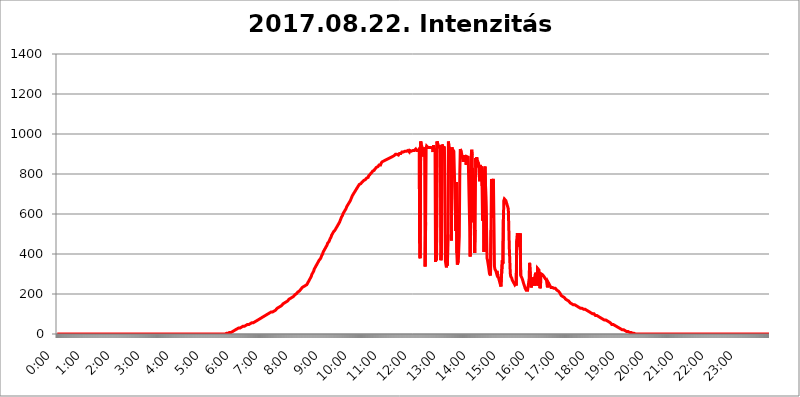
| Category | 2017.08.22. Intenzitás [W/m^2] |
|---|---|
| 0.0 | 0 |
| 0.0006944444444444445 | 0 |
| 0.001388888888888889 | 0 |
| 0.0020833333333333333 | 0 |
| 0.002777777777777778 | 0 |
| 0.003472222222222222 | 0 |
| 0.004166666666666667 | 0 |
| 0.004861111111111111 | 0 |
| 0.005555555555555556 | 0 |
| 0.0062499999999999995 | 0 |
| 0.006944444444444444 | 0 |
| 0.007638888888888889 | 0 |
| 0.008333333333333333 | 0 |
| 0.009027777777777779 | 0 |
| 0.009722222222222222 | 0 |
| 0.010416666666666666 | 0 |
| 0.011111111111111112 | 0 |
| 0.011805555555555555 | 0 |
| 0.012499999999999999 | 0 |
| 0.013194444444444444 | 0 |
| 0.013888888888888888 | 0 |
| 0.014583333333333332 | 0 |
| 0.015277777777777777 | 0 |
| 0.015972222222222224 | 0 |
| 0.016666666666666666 | 0 |
| 0.017361111111111112 | 0 |
| 0.018055555555555557 | 0 |
| 0.01875 | 0 |
| 0.019444444444444445 | 0 |
| 0.02013888888888889 | 0 |
| 0.020833333333333332 | 0 |
| 0.02152777777777778 | 0 |
| 0.022222222222222223 | 0 |
| 0.02291666666666667 | 0 |
| 0.02361111111111111 | 0 |
| 0.024305555555555556 | 0 |
| 0.024999999999999998 | 0 |
| 0.025694444444444447 | 0 |
| 0.02638888888888889 | 0 |
| 0.027083333333333334 | 0 |
| 0.027777777777777776 | 0 |
| 0.02847222222222222 | 0 |
| 0.029166666666666664 | 0 |
| 0.029861111111111113 | 0 |
| 0.030555555555555555 | 0 |
| 0.03125 | 0 |
| 0.03194444444444445 | 0 |
| 0.03263888888888889 | 0 |
| 0.03333333333333333 | 0 |
| 0.034027777777777775 | 0 |
| 0.034722222222222224 | 0 |
| 0.035416666666666666 | 0 |
| 0.036111111111111115 | 0 |
| 0.03680555555555556 | 0 |
| 0.0375 | 0 |
| 0.03819444444444444 | 0 |
| 0.03888888888888889 | 0 |
| 0.03958333333333333 | 0 |
| 0.04027777777777778 | 0 |
| 0.04097222222222222 | 0 |
| 0.041666666666666664 | 0 |
| 0.042361111111111106 | 0 |
| 0.04305555555555556 | 0 |
| 0.043750000000000004 | 0 |
| 0.044444444444444446 | 0 |
| 0.04513888888888889 | 0 |
| 0.04583333333333334 | 0 |
| 0.04652777777777778 | 0 |
| 0.04722222222222222 | 0 |
| 0.04791666666666666 | 0 |
| 0.04861111111111111 | 0 |
| 0.049305555555555554 | 0 |
| 0.049999999999999996 | 0 |
| 0.05069444444444445 | 0 |
| 0.051388888888888894 | 0 |
| 0.052083333333333336 | 0 |
| 0.05277777777777778 | 0 |
| 0.05347222222222222 | 0 |
| 0.05416666666666667 | 0 |
| 0.05486111111111111 | 0 |
| 0.05555555555555555 | 0 |
| 0.05625 | 0 |
| 0.05694444444444444 | 0 |
| 0.057638888888888885 | 0 |
| 0.05833333333333333 | 0 |
| 0.05902777777777778 | 0 |
| 0.059722222222222225 | 0 |
| 0.06041666666666667 | 0 |
| 0.061111111111111116 | 0 |
| 0.06180555555555556 | 0 |
| 0.0625 | 0 |
| 0.06319444444444444 | 0 |
| 0.06388888888888888 | 0 |
| 0.06458333333333334 | 0 |
| 0.06527777777777778 | 0 |
| 0.06597222222222222 | 0 |
| 0.06666666666666667 | 0 |
| 0.06736111111111111 | 0 |
| 0.06805555555555555 | 0 |
| 0.06874999999999999 | 0 |
| 0.06944444444444443 | 0 |
| 0.07013888888888889 | 0 |
| 0.07083333333333333 | 0 |
| 0.07152777777777779 | 0 |
| 0.07222222222222223 | 0 |
| 0.07291666666666667 | 0 |
| 0.07361111111111111 | 0 |
| 0.07430555555555556 | 0 |
| 0.075 | 0 |
| 0.07569444444444444 | 0 |
| 0.0763888888888889 | 0 |
| 0.07708333333333334 | 0 |
| 0.07777777777777778 | 0 |
| 0.07847222222222222 | 0 |
| 0.07916666666666666 | 0 |
| 0.0798611111111111 | 0 |
| 0.08055555555555556 | 0 |
| 0.08125 | 0 |
| 0.08194444444444444 | 0 |
| 0.08263888888888889 | 0 |
| 0.08333333333333333 | 0 |
| 0.08402777777777777 | 0 |
| 0.08472222222222221 | 0 |
| 0.08541666666666665 | 0 |
| 0.08611111111111112 | 0 |
| 0.08680555555555557 | 0 |
| 0.08750000000000001 | 0 |
| 0.08819444444444445 | 0 |
| 0.08888888888888889 | 0 |
| 0.08958333333333333 | 0 |
| 0.09027777777777778 | 0 |
| 0.09097222222222222 | 0 |
| 0.09166666666666667 | 0 |
| 0.09236111111111112 | 0 |
| 0.09305555555555556 | 0 |
| 0.09375 | 0 |
| 0.09444444444444444 | 0 |
| 0.09513888888888888 | 0 |
| 0.09583333333333333 | 0 |
| 0.09652777777777777 | 0 |
| 0.09722222222222222 | 0 |
| 0.09791666666666667 | 0 |
| 0.09861111111111111 | 0 |
| 0.09930555555555555 | 0 |
| 0.09999999999999999 | 0 |
| 0.10069444444444443 | 0 |
| 0.1013888888888889 | 0 |
| 0.10208333333333335 | 0 |
| 0.10277777777777779 | 0 |
| 0.10347222222222223 | 0 |
| 0.10416666666666667 | 0 |
| 0.10486111111111111 | 0 |
| 0.10555555555555556 | 0 |
| 0.10625 | 0 |
| 0.10694444444444444 | 0 |
| 0.1076388888888889 | 0 |
| 0.10833333333333334 | 0 |
| 0.10902777777777778 | 0 |
| 0.10972222222222222 | 0 |
| 0.1111111111111111 | 0 |
| 0.11180555555555556 | 0 |
| 0.11180555555555556 | 0 |
| 0.1125 | 0 |
| 0.11319444444444444 | 0 |
| 0.11388888888888889 | 0 |
| 0.11458333333333333 | 0 |
| 0.11527777777777777 | 0 |
| 0.11597222222222221 | 0 |
| 0.11666666666666665 | 0 |
| 0.1173611111111111 | 0 |
| 0.11805555555555557 | 0 |
| 0.11944444444444445 | 0 |
| 0.12013888888888889 | 0 |
| 0.12083333333333333 | 0 |
| 0.12152777777777778 | 0 |
| 0.12222222222222223 | 0 |
| 0.12291666666666667 | 0 |
| 0.12291666666666667 | 0 |
| 0.12361111111111112 | 0 |
| 0.12430555555555556 | 0 |
| 0.125 | 0 |
| 0.12569444444444444 | 0 |
| 0.12638888888888888 | 0 |
| 0.12708333333333333 | 0 |
| 0.16875 | 0 |
| 0.12847222222222224 | 0 |
| 0.12916666666666668 | 0 |
| 0.12986111111111112 | 0 |
| 0.13055555555555556 | 0 |
| 0.13125 | 0 |
| 0.13194444444444445 | 0 |
| 0.1326388888888889 | 0 |
| 0.13333333333333333 | 0 |
| 0.13402777777777777 | 0 |
| 0.13402777777777777 | 0 |
| 0.13472222222222222 | 0 |
| 0.13541666666666666 | 0 |
| 0.1361111111111111 | 0 |
| 0.13749999999999998 | 0 |
| 0.13819444444444443 | 0 |
| 0.1388888888888889 | 0 |
| 0.13958333333333334 | 0 |
| 0.14027777777777778 | 0 |
| 0.14097222222222222 | 0 |
| 0.14166666666666666 | 0 |
| 0.1423611111111111 | 0 |
| 0.14305555555555557 | 0 |
| 0.14375000000000002 | 0 |
| 0.14444444444444446 | 0 |
| 0.1451388888888889 | 0 |
| 0.1451388888888889 | 0 |
| 0.14652777777777778 | 0 |
| 0.14722222222222223 | 0 |
| 0.14791666666666667 | 0 |
| 0.1486111111111111 | 0 |
| 0.14930555555555555 | 0 |
| 0.15 | 0 |
| 0.15069444444444444 | 0 |
| 0.15138888888888888 | 0 |
| 0.15208333333333332 | 0 |
| 0.15277777777777776 | 0 |
| 0.15347222222222223 | 0 |
| 0.15416666666666667 | 0 |
| 0.15486111111111112 | 0 |
| 0.15555555555555556 | 0 |
| 0.15625 | 0 |
| 0.15694444444444444 | 0 |
| 0.15763888888888888 | 0 |
| 0.15833333333333333 | 0 |
| 0.15902777777777777 | 0 |
| 0.15972222222222224 | 0 |
| 0.16041666666666668 | 0 |
| 0.16111111111111112 | 0 |
| 0.16180555555555556 | 0 |
| 0.1625 | 0 |
| 0.16319444444444445 | 0 |
| 0.1638888888888889 | 0 |
| 0.16458333333333333 | 0 |
| 0.16527777777777777 | 0 |
| 0.16597222222222222 | 0 |
| 0.16666666666666666 | 0 |
| 0.1673611111111111 | 0 |
| 0.16805555555555554 | 0 |
| 0.16874999999999998 | 0 |
| 0.16944444444444443 | 0 |
| 0.17013888888888887 | 0 |
| 0.1708333333333333 | 0 |
| 0.17152777777777775 | 0 |
| 0.17222222222222225 | 0 |
| 0.1729166666666667 | 0 |
| 0.17361111111111113 | 0 |
| 0.17430555555555557 | 0 |
| 0.17500000000000002 | 0 |
| 0.17569444444444446 | 0 |
| 0.1763888888888889 | 0 |
| 0.17708333333333334 | 0 |
| 0.17777777777777778 | 0 |
| 0.17847222222222223 | 0 |
| 0.17916666666666667 | 0 |
| 0.1798611111111111 | 0 |
| 0.18055555555555555 | 0 |
| 0.18125 | 0 |
| 0.18194444444444444 | 0 |
| 0.1826388888888889 | 0 |
| 0.18333333333333335 | 0 |
| 0.1840277777777778 | 0 |
| 0.18472222222222223 | 0 |
| 0.18541666666666667 | 0 |
| 0.18611111111111112 | 0 |
| 0.18680555555555556 | 0 |
| 0.1875 | 0 |
| 0.18819444444444444 | 0 |
| 0.18888888888888888 | 0 |
| 0.18958333333333333 | 0 |
| 0.19027777777777777 | 0 |
| 0.1909722222222222 | 0 |
| 0.19166666666666665 | 0 |
| 0.19236111111111112 | 0 |
| 0.19305555555555554 | 0 |
| 0.19375 | 0 |
| 0.19444444444444445 | 0 |
| 0.1951388888888889 | 0 |
| 0.19583333333333333 | 0 |
| 0.19652777777777777 | 0 |
| 0.19722222222222222 | 0 |
| 0.19791666666666666 | 0 |
| 0.1986111111111111 | 0 |
| 0.19930555555555554 | 0 |
| 0.19999999999999998 | 0 |
| 0.20069444444444443 | 0 |
| 0.20138888888888887 | 0 |
| 0.2020833333333333 | 0 |
| 0.2027777777777778 | 0 |
| 0.2034722222222222 | 0 |
| 0.2041666666666667 | 0 |
| 0.20486111111111113 | 0 |
| 0.20555555555555557 | 0 |
| 0.20625000000000002 | 0 |
| 0.20694444444444446 | 0 |
| 0.2076388888888889 | 0 |
| 0.20833333333333334 | 0 |
| 0.20902777777777778 | 0 |
| 0.20972222222222223 | 0 |
| 0.21041666666666667 | 0 |
| 0.2111111111111111 | 0 |
| 0.21180555555555555 | 0 |
| 0.2125 | 0 |
| 0.21319444444444444 | 0 |
| 0.2138888888888889 | 0 |
| 0.21458333333333335 | 0 |
| 0.2152777777777778 | 0 |
| 0.21597222222222223 | 0 |
| 0.21666666666666667 | 0 |
| 0.21736111111111112 | 0 |
| 0.21805555555555556 | 0 |
| 0.21875 | 0 |
| 0.21944444444444444 | 0 |
| 0.22013888888888888 | 0 |
| 0.22083333333333333 | 0 |
| 0.22152777777777777 | 0 |
| 0.2222222222222222 | 0 |
| 0.22291666666666665 | 0 |
| 0.2236111111111111 | 0 |
| 0.22430555555555556 | 0 |
| 0.225 | 0 |
| 0.22569444444444445 | 0 |
| 0.2263888888888889 | 0 |
| 0.22708333333333333 | 0 |
| 0.22777777777777777 | 0 |
| 0.22847222222222222 | 0 |
| 0.22916666666666666 | 0 |
| 0.2298611111111111 | 0 |
| 0.23055555555555554 | 0 |
| 0.23124999999999998 | 0 |
| 0.23194444444444443 | 0 |
| 0.23263888888888887 | 0 |
| 0.2333333333333333 | 0 |
| 0.2340277777777778 | 0 |
| 0.2347222222222222 | 0 |
| 0.2354166666666667 | 0 |
| 0.23611111111111113 | 3.525 |
| 0.23680555555555557 | 3.525 |
| 0.23750000000000002 | 3.525 |
| 0.23819444444444446 | 3.525 |
| 0.2388888888888889 | 3.525 |
| 0.23958333333333334 | 3.525 |
| 0.24027777777777778 | 3.525 |
| 0.24097222222222223 | 3.525 |
| 0.24166666666666667 | 7.887 |
| 0.2423611111111111 | 7.887 |
| 0.24305555555555555 | 7.887 |
| 0.24375 | 7.887 |
| 0.24444444444444446 | 12.257 |
| 0.24513888888888888 | 12.257 |
| 0.24583333333333335 | 12.257 |
| 0.2465277777777778 | 12.257 |
| 0.24722222222222223 | 16.636 |
| 0.24791666666666667 | 16.636 |
| 0.24861111111111112 | 16.636 |
| 0.24930555555555556 | 21.024 |
| 0.25 | 21.024 |
| 0.25069444444444444 | 21.024 |
| 0.2513888888888889 | 25.419 |
| 0.2520833333333333 | 25.419 |
| 0.25277777777777777 | 25.419 |
| 0.2534722222222222 | 29.823 |
| 0.25416666666666665 | 29.823 |
| 0.2548611111111111 | 29.823 |
| 0.2555555555555556 | 29.823 |
| 0.25625000000000003 | 29.823 |
| 0.2569444444444445 | 34.234 |
| 0.2576388888888889 | 34.234 |
| 0.25833333333333336 | 34.234 |
| 0.2590277777777778 | 34.234 |
| 0.25972222222222224 | 34.234 |
| 0.2604166666666667 | 38.653 |
| 0.2611111111111111 | 38.653 |
| 0.26180555555555557 | 38.653 |
| 0.2625 | 38.653 |
| 0.26319444444444445 | 38.653 |
| 0.2638888888888889 | 43.079 |
| 0.26458333333333334 | 43.079 |
| 0.2652777777777778 | 43.079 |
| 0.2659722222222222 | 47.511 |
| 0.26666666666666666 | 47.511 |
| 0.2673611111111111 | 47.511 |
| 0.26805555555555555 | 47.511 |
| 0.26875 | 47.511 |
| 0.26944444444444443 | 51.951 |
| 0.2701388888888889 | 51.951 |
| 0.2708333333333333 | 51.951 |
| 0.27152777777777776 | 56.398 |
| 0.2722222222222222 | 56.398 |
| 0.27291666666666664 | 56.398 |
| 0.2736111111111111 | 56.398 |
| 0.2743055555555555 | 56.398 |
| 0.27499999999999997 | 56.398 |
| 0.27569444444444446 | 60.85 |
| 0.27638888888888885 | 60.85 |
| 0.27708333333333335 | 60.85 |
| 0.2777777777777778 | 65.31 |
| 0.27847222222222223 | 65.31 |
| 0.2791666666666667 | 65.31 |
| 0.2798611111111111 | 65.31 |
| 0.28055555555555556 | 69.775 |
| 0.28125 | 69.775 |
| 0.28194444444444444 | 69.775 |
| 0.2826388888888889 | 74.246 |
| 0.2833333333333333 | 74.246 |
| 0.28402777777777777 | 74.246 |
| 0.2847222222222222 | 78.722 |
| 0.28541666666666665 | 78.722 |
| 0.28611111111111115 | 78.722 |
| 0.28680555555555554 | 83.205 |
| 0.28750000000000003 | 83.205 |
| 0.2881944444444445 | 83.205 |
| 0.2888888888888889 | 83.205 |
| 0.28958333333333336 | 87.692 |
| 0.2902777777777778 | 87.692 |
| 0.29097222222222224 | 92.184 |
| 0.2916666666666667 | 92.184 |
| 0.2923611111111111 | 92.184 |
| 0.29305555555555557 | 92.184 |
| 0.29375 | 96.682 |
| 0.29444444444444445 | 96.682 |
| 0.2951388888888889 | 101.184 |
| 0.29583333333333334 | 101.184 |
| 0.2965277777777778 | 101.184 |
| 0.2972222222222222 | 101.184 |
| 0.29791666666666666 | 105.69 |
| 0.2986111111111111 | 105.69 |
| 0.29930555555555555 | 105.69 |
| 0.3 | 110.201 |
| 0.30069444444444443 | 110.201 |
| 0.3013888888888889 | 110.201 |
| 0.3020833333333333 | 110.201 |
| 0.30277777777777776 | 114.716 |
| 0.3034722222222222 | 114.716 |
| 0.30416666666666664 | 114.716 |
| 0.3048611111111111 | 119.235 |
| 0.3055555555555555 | 119.235 |
| 0.30624999999999997 | 119.235 |
| 0.3069444444444444 | 123.758 |
| 0.3076388888888889 | 123.758 |
| 0.30833333333333335 | 128.284 |
| 0.3090277777777778 | 128.284 |
| 0.30972222222222223 | 128.284 |
| 0.3104166666666667 | 132.814 |
| 0.3111111111111111 | 132.814 |
| 0.31180555555555556 | 137.347 |
| 0.3125 | 137.347 |
| 0.31319444444444444 | 141.884 |
| 0.3138888888888889 | 141.884 |
| 0.3145833333333333 | 141.884 |
| 0.31527777777777777 | 146.423 |
| 0.3159722222222222 | 146.423 |
| 0.31666666666666665 | 150.964 |
| 0.31736111111111115 | 150.964 |
| 0.31805555555555554 | 155.509 |
| 0.31875000000000003 | 155.509 |
| 0.3194444444444445 | 155.509 |
| 0.3201388888888889 | 160.056 |
| 0.32083333333333336 | 160.056 |
| 0.3215277777777778 | 160.056 |
| 0.32222222222222224 | 164.605 |
| 0.3229166666666667 | 164.605 |
| 0.3236111111111111 | 169.156 |
| 0.32430555555555557 | 169.156 |
| 0.325 | 173.709 |
| 0.32569444444444445 | 173.709 |
| 0.3263888888888889 | 173.709 |
| 0.32708333333333334 | 178.264 |
| 0.3277777777777778 | 178.264 |
| 0.3284722222222222 | 182.82 |
| 0.32916666666666666 | 182.82 |
| 0.3298611111111111 | 187.378 |
| 0.33055555555555555 | 187.378 |
| 0.33125 | 187.378 |
| 0.33194444444444443 | 191.937 |
| 0.3326388888888889 | 191.937 |
| 0.3333333333333333 | 196.497 |
| 0.3340277777777778 | 196.497 |
| 0.3347222222222222 | 201.058 |
| 0.3354166666666667 | 201.058 |
| 0.3361111111111111 | 205.62 |
| 0.3368055555555556 | 205.62 |
| 0.33749999999999997 | 210.182 |
| 0.33819444444444446 | 210.182 |
| 0.33888888888888885 | 214.746 |
| 0.33958333333333335 | 214.746 |
| 0.34027777777777773 | 219.309 |
| 0.34097222222222223 | 219.309 |
| 0.3416666666666666 | 223.873 |
| 0.3423611111111111 | 228.436 |
| 0.3430555555555555 | 228.436 |
| 0.34375 | 233 |
| 0.3444444444444445 | 233 |
| 0.3451388888888889 | 233 |
| 0.3458333333333334 | 237.564 |
| 0.34652777777777777 | 242.127 |
| 0.34722222222222227 | 242.127 |
| 0.34791666666666665 | 242.127 |
| 0.34861111111111115 | 246.689 |
| 0.34930555555555554 | 246.689 |
| 0.35000000000000003 | 246.689 |
| 0.3506944444444444 | 251.251 |
| 0.3513888888888889 | 255.813 |
| 0.3520833333333333 | 260.373 |
| 0.3527777777777778 | 264.932 |
| 0.3534722222222222 | 269.49 |
| 0.3541666666666667 | 269.49 |
| 0.3548611111111111 | 278.603 |
| 0.35555555555555557 | 283.156 |
| 0.35625 | 287.709 |
| 0.35694444444444445 | 296.808 |
| 0.3576388888888889 | 301.354 |
| 0.35833333333333334 | 305.898 |
| 0.3590277777777778 | 310.44 |
| 0.3597222222222222 | 314.98 |
| 0.36041666666666666 | 324.052 |
| 0.3611111111111111 | 328.584 |
| 0.36180555555555555 | 333.113 |
| 0.3625 | 337.639 |
| 0.36319444444444443 | 342.162 |
| 0.3638888888888889 | 346.682 |
| 0.3645833333333333 | 351.198 |
| 0.3652777777777778 | 355.712 |
| 0.3659722222222222 | 360.221 |
| 0.3666666666666667 | 360.221 |
| 0.3673611111111111 | 369.23 |
| 0.3680555555555556 | 369.23 |
| 0.36874999999999997 | 373.729 |
| 0.36944444444444446 | 378.224 |
| 0.37013888888888885 | 382.715 |
| 0.37083333333333335 | 391.685 |
| 0.37152777777777773 | 396.164 |
| 0.37222222222222223 | 400.638 |
| 0.3729166666666666 | 409.574 |
| 0.3736111111111111 | 414.035 |
| 0.3743055555555555 | 418.492 |
| 0.375 | 422.943 |
| 0.3756944444444445 | 427.39 |
| 0.3763888888888889 | 431.833 |
| 0.3770833333333334 | 436.27 |
| 0.37777777777777777 | 440.702 |
| 0.37847222222222227 | 445.129 |
| 0.37916666666666665 | 453.968 |
| 0.37986111111111115 | 458.38 |
| 0.38055555555555554 | 458.38 |
| 0.38125000000000003 | 462.786 |
| 0.3819444444444444 | 467.187 |
| 0.3826388888888889 | 475.972 |
| 0.3833333333333333 | 480.356 |
| 0.3840277777777778 | 484.735 |
| 0.3847222222222222 | 493.475 |
| 0.3854166666666667 | 497.836 |
| 0.3861111111111111 | 502.192 |
| 0.38680555555555557 | 506.542 |
| 0.3875 | 510.885 |
| 0.38819444444444445 | 515.223 |
| 0.3888888888888889 | 515.223 |
| 0.38958333333333334 | 519.555 |
| 0.3902777777777778 | 519.555 |
| 0.3909722222222222 | 528.2 |
| 0.39166666666666666 | 532.513 |
| 0.3923611111111111 | 536.82 |
| 0.39305555555555555 | 541.121 |
| 0.39375 | 536.82 |
| 0.39444444444444443 | 549.704 |
| 0.3951388888888889 | 553.986 |
| 0.3958333333333333 | 558.261 |
| 0.3965277777777778 | 562.53 |
| 0.3972222222222222 | 571.049 |
| 0.3979166666666667 | 575.299 |
| 0.3986111111111111 | 583.779 |
| 0.3993055555555556 | 588.009 |
| 0.39999999999999997 | 592.233 |
| 0.40069444444444446 | 600.661 |
| 0.40138888888888885 | 600.661 |
| 0.40208333333333335 | 609.062 |
| 0.40277777777777773 | 613.252 |
| 0.40347222222222223 | 617.436 |
| 0.4041666666666666 | 621.613 |
| 0.4048611111111111 | 625.784 |
| 0.4055555555555555 | 629.948 |
| 0.40625 | 638.256 |
| 0.4069444444444445 | 642.4 |
| 0.4076388888888889 | 646.537 |
| 0.4083333333333334 | 650.667 |
| 0.40902777777777777 | 650.667 |
| 0.40972222222222227 | 658.909 |
| 0.41041666666666665 | 658.909 |
| 0.41111111111111115 | 667.123 |
| 0.41180555555555554 | 671.22 |
| 0.41250000000000003 | 679.395 |
| 0.4131944444444444 | 683.473 |
| 0.4138888888888889 | 691.608 |
| 0.4145833333333333 | 695.666 |
| 0.4152777777777778 | 699.717 |
| 0.4159722222222222 | 703.762 |
| 0.4166666666666667 | 707.8 |
| 0.4173611111111111 | 711.832 |
| 0.41805555555555557 | 715.858 |
| 0.41875 | 719.877 |
| 0.41944444444444445 | 723.889 |
| 0.4201388888888889 | 727.896 |
| 0.42083333333333334 | 731.896 |
| 0.4215277777777778 | 735.89 |
| 0.4222222222222222 | 739.877 |
| 0.42291666666666666 | 743.859 |
| 0.4236111111111111 | 747.834 |
| 0.42430555555555555 | 751.803 |
| 0.425 | 751.803 |
| 0.42569444444444443 | 751.803 |
| 0.4263888888888889 | 755.766 |
| 0.4270833333333333 | 755.766 |
| 0.4277777777777778 | 759.723 |
| 0.4284722222222222 | 759.723 |
| 0.4291666666666667 | 763.674 |
| 0.4298611111111111 | 767.62 |
| 0.4305555555555556 | 771.559 |
| 0.43124999999999997 | 771.559 |
| 0.43194444444444446 | 771.559 |
| 0.43263888888888885 | 775.492 |
| 0.43333333333333335 | 775.492 |
| 0.43402777777777773 | 779.42 |
| 0.43472222222222223 | 783.342 |
| 0.4354166666666666 | 783.342 |
| 0.4361111111111111 | 783.342 |
| 0.4368055555555555 | 791.169 |
| 0.4375 | 795.074 |
| 0.4381944444444445 | 795.074 |
| 0.4388888888888889 | 798.974 |
| 0.4395833333333334 | 798.974 |
| 0.44027777777777777 | 802.868 |
| 0.44097222222222227 | 806.757 |
| 0.44166666666666665 | 810.641 |
| 0.44236111111111115 | 814.519 |
| 0.44305555555555554 | 814.519 |
| 0.44375000000000003 | 814.519 |
| 0.4444444444444444 | 818.392 |
| 0.4451388888888889 | 822.26 |
| 0.4458333333333333 | 826.123 |
| 0.4465277777777778 | 829.981 |
| 0.4472222222222222 | 826.123 |
| 0.4479166666666667 | 833.834 |
| 0.4486111111111111 | 833.834 |
| 0.44930555555555557 | 837.682 |
| 0.45 | 837.682 |
| 0.45069444444444445 | 841.526 |
| 0.4513888888888889 | 845.365 |
| 0.45208333333333334 | 845.365 |
| 0.4527777777777778 | 849.199 |
| 0.4534722222222222 | 845.365 |
| 0.45416666666666666 | 853.029 |
| 0.4548611111111111 | 856.855 |
| 0.45555555555555555 | 860.676 |
| 0.45625 | 860.676 |
| 0.45694444444444443 | 864.493 |
| 0.4576388888888889 | 864.493 |
| 0.4583333333333333 | 864.493 |
| 0.4590277777777778 | 864.493 |
| 0.4597222222222222 | 868.305 |
| 0.4604166666666667 | 872.114 |
| 0.4611111111111111 | 868.305 |
| 0.4618055555555556 | 872.114 |
| 0.46249999999999997 | 872.114 |
| 0.46319444444444446 | 875.918 |
| 0.46388888888888885 | 875.918 |
| 0.46458333333333335 | 875.918 |
| 0.46527777777777773 | 879.719 |
| 0.46597222222222223 | 879.719 |
| 0.4666666666666666 | 879.719 |
| 0.4673611111111111 | 883.516 |
| 0.4680555555555555 | 883.516 |
| 0.46875 | 883.516 |
| 0.4694444444444445 | 883.516 |
| 0.4701388888888889 | 887.309 |
| 0.4708333333333334 | 887.309 |
| 0.47152777777777777 | 891.099 |
| 0.47222222222222227 | 891.099 |
| 0.47291666666666665 | 894.885 |
| 0.47361111111111115 | 894.885 |
| 0.47430555555555554 | 898.668 |
| 0.47500000000000003 | 898.668 |
| 0.4756944444444444 | 898.668 |
| 0.4763888888888889 | 898.668 |
| 0.4770833333333333 | 898.668 |
| 0.4777777777777778 | 898.668 |
| 0.4784722222222222 | 894.885 |
| 0.4791666666666667 | 898.668 |
| 0.4798611111111111 | 902.447 |
| 0.48055555555555557 | 902.447 |
| 0.48125 | 902.447 |
| 0.48194444444444445 | 902.447 |
| 0.4826388888888889 | 906.223 |
| 0.48333333333333334 | 909.996 |
| 0.4840277777777778 | 909.996 |
| 0.4847222222222222 | 909.996 |
| 0.48541666666666666 | 909.996 |
| 0.4861111111111111 | 909.996 |
| 0.48680555555555555 | 913.766 |
| 0.4875 | 913.766 |
| 0.48819444444444443 | 913.766 |
| 0.4888888888888889 | 913.766 |
| 0.4895833333333333 | 913.766 |
| 0.4902777777777778 | 917.534 |
| 0.4909722222222222 | 917.534 |
| 0.4916666666666667 | 917.534 |
| 0.4923611111111111 | 917.534 |
| 0.4930555555555556 | 917.534 |
| 0.49374999999999997 | 909.996 |
| 0.49444444444444446 | 917.534 |
| 0.49513888888888885 | 917.534 |
| 0.49583333333333335 | 913.766 |
| 0.49652777777777773 | 913.766 |
| 0.49722222222222223 | 913.766 |
| 0.4979166666666666 | 913.766 |
| 0.4986111111111111 | 917.534 |
| 0.4993055555555555 | 917.534 |
| 0.5 | 917.534 |
| 0.5006944444444444 | 917.534 |
| 0.5013888888888889 | 921.298 |
| 0.5020833333333333 | 913.766 |
| 0.5027777777777778 | 925.06 |
| 0.5034722222222222 | 921.298 |
| 0.5041666666666667 | 917.534 |
| 0.5048611111111111 | 917.534 |
| 0.5055555555555555 | 917.534 |
| 0.50625 | 917.534 |
| 0.5069444444444444 | 921.298 |
| 0.5076388888888889 | 925.06 |
| 0.5083333333333333 | 387.202 |
| 0.5090277777777777 | 378.224 |
| 0.5097222222222222 | 962.555 |
| 0.5104166666666666 | 947.58 |
| 0.5111111111111112 | 940.082 |
| 0.5118055555555555 | 932.576 |
| 0.5125000000000001 | 936.33 |
| 0.5131944444444444 | 936.33 |
| 0.513888888888889 | 887.309 |
| 0.5145833333333333 | 932.576 |
| 0.5152777777777778 | 925.06 |
| 0.5159722222222222 | 337.639 |
| 0.5166666666666667 | 558.261 |
| 0.517361111111111 | 928.819 |
| 0.5180555555555556 | 940.082 |
| 0.5187499999999999 | 940.082 |
| 0.5194444444444445 | 936.33 |
| 0.5201388888888888 | 932.576 |
| 0.5208333333333334 | 932.576 |
| 0.5215277777777778 | 928.819 |
| 0.5222222222222223 | 932.576 |
| 0.5229166666666667 | 932.576 |
| 0.5236111111111111 | 932.576 |
| 0.5243055555555556 | 932.576 |
| 0.525 | 932.576 |
| 0.5256944444444445 | 932.576 |
| 0.5263888888888889 | 928.819 |
| 0.5270833333333333 | 909.996 |
| 0.5277777777777778 | 943.832 |
| 0.5284722222222222 | 932.576 |
| 0.5291666666666667 | 936.33 |
| 0.5298611111111111 | 921.298 |
| 0.5305555555555556 | 360.221 |
| 0.53125 | 783.342 |
| 0.5319444444444444 | 369.23 |
| 0.5326388888888889 | 962.555 |
| 0.5333333333333333 | 955.071 |
| 0.5340277777777778 | 947.58 |
| 0.5347222222222222 | 940.082 |
| 0.5354166666666667 | 936.33 |
| 0.5361111111111111 | 932.576 |
| 0.5368055555555555 | 932.576 |
| 0.5375 | 943.832 |
| 0.5381944444444444 | 369.23 |
| 0.5388888888888889 | 414.035 |
| 0.5395833333333333 | 947.58 |
| 0.5402777777777777 | 943.832 |
| 0.5409722222222222 | 936.33 |
| 0.5416666666666666 | 936.33 |
| 0.5423611111111112 | 932.576 |
| 0.5430555555555555 | 932.576 |
| 0.5437500000000001 | 936.33 |
| 0.5444444444444444 | 364.728 |
| 0.545138888888889 | 346.682 |
| 0.5458333333333333 | 333.113 |
| 0.5465277777777778 | 351.198 |
| 0.5472222222222222 | 342.162 |
| 0.5479166666666667 | 497.836 |
| 0.548611111111111 | 962.555 |
| 0.5493055555555556 | 940.082 |
| 0.5499999999999999 | 932.576 |
| 0.5506944444444445 | 928.819 |
| 0.5513888888888888 | 925.06 |
| 0.5520833333333334 | 921.298 |
| 0.5527777777777778 | 467.187 |
| 0.5534722222222223 | 932.576 |
| 0.5541666666666667 | 925.06 |
| 0.5548611111111111 | 921.298 |
| 0.5555555555555556 | 925.06 |
| 0.55625 | 913.766 |
| 0.5569444444444445 | 909.996 |
| 0.5576388888888889 | 909.996 |
| 0.5583333333333333 | 617.436 |
| 0.5590277777777778 | 515.223 |
| 0.5597222222222222 | 759.723 |
| 0.5604166666666667 | 405.108 |
| 0.5611111111111111 | 346.682 |
| 0.5618055555555556 | 342.162 |
| 0.5625 | 364.728 |
| 0.5631944444444444 | 369.23 |
| 0.5638888888888889 | 489.108 |
| 0.5645833333333333 | 806.757 |
| 0.5652777777777778 | 925.06 |
| 0.5659722222222222 | 925.06 |
| 0.5666666666666667 | 909.996 |
| 0.5673611111111111 | 898.668 |
| 0.5680555555555555 | 902.447 |
| 0.56875 | 894.885 |
| 0.5694444444444444 | 860.676 |
| 0.5701388888888889 | 887.309 |
| 0.5708333333333333 | 887.309 |
| 0.5715277777777777 | 883.516 |
| 0.5722222222222222 | 887.309 |
| 0.5729166666666666 | 891.099 |
| 0.5736111111111112 | 845.365 |
| 0.5743055555555555 | 887.309 |
| 0.5750000000000001 | 883.516 |
| 0.5756944444444444 | 883.516 |
| 0.576388888888889 | 883.516 |
| 0.5770833333333333 | 879.719 |
| 0.5777777777777778 | 887.309 |
| 0.5784722222222222 | 532.513 |
| 0.5791666666666667 | 387.202 |
| 0.579861111111111 | 642.4 |
| 0.5805555555555556 | 887.309 |
| 0.5812499999999999 | 921.298 |
| 0.5819444444444445 | 894.885 |
| 0.5826388888888888 | 739.877 |
| 0.5833333333333334 | 771.559 |
| 0.5840277777777778 | 558.261 |
| 0.5847222222222223 | 663.019 |
| 0.5854166666666667 | 405.108 |
| 0.5861111111111111 | 519.555 |
| 0.5868055555555556 | 879.719 |
| 0.5875 | 833.834 |
| 0.5881944444444445 | 883.516 |
| 0.5888888888888889 | 872.114 |
| 0.5895833333333333 | 864.493 |
| 0.5902777777777778 | 860.676 |
| 0.5909722222222222 | 853.029 |
| 0.5916666666666667 | 849.199 |
| 0.5923611111111111 | 763.674 |
| 0.5930555555555556 | 845.365 |
| 0.59375 | 841.526 |
| 0.5944444444444444 | 806.757 |
| 0.5951388888888889 | 837.682 |
| 0.5958333333333333 | 739.877 |
| 0.5965277777777778 | 566.793 |
| 0.5972222222222222 | 671.22 |
| 0.5979166666666667 | 715.858 |
| 0.5986111111111111 | 409.574 |
| 0.5993055555555555 | 818.392 |
| 0.6 | 837.682 |
| 0.6006944444444444 | 837.682 |
| 0.6013888888888889 | 837.682 |
| 0.6020833333333333 | 532.513 |
| 0.6027777777777777 | 378.224 |
| 0.6034722222222222 | 369.23 |
| 0.6041666666666666 | 369.23 |
| 0.6048611111111112 | 337.639 |
| 0.6055555555555555 | 342.162 |
| 0.6062500000000001 | 301.354 |
| 0.6069444444444444 | 296.808 |
| 0.607638888888889 | 292.259 |
| 0.6083333333333333 | 519.555 |
| 0.6090277777777778 | 775.492 |
| 0.6097222222222222 | 723.889 |
| 0.6104166666666667 | 579.542 |
| 0.611111111111111 | 775.492 |
| 0.6118055555555556 | 755.766 |
| 0.6124999999999999 | 553.986 |
| 0.6131944444444445 | 337.639 |
| 0.6138888888888888 | 324.052 |
| 0.6145833333333334 | 324.052 |
| 0.6152777777777778 | 314.98 |
| 0.6159722222222223 | 305.898 |
| 0.6166666666666667 | 314.98 |
| 0.6173611111111111 | 319.517 |
| 0.6180555555555556 | 292.259 |
| 0.61875 | 287.709 |
| 0.6194444444444445 | 274.047 |
| 0.6201388888888889 | 264.932 |
| 0.6208333333333333 | 255.813 |
| 0.6215277777777778 | 246.689 |
| 0.6222222222222222 | 237.564 |
| 0.6229166666666667 | 233 |
| 0.6236111111111111 | 233 |
| 0.6243055555555556 | 369.23 |
| 0.625 | 351.198 |
| 0.6256944444444444 | 571.049 |
| 0.6263888888888889 | 667.123 |
| 0.6270833333333333 | 675.311 |
| 0.6277777777777778 | 679.395 |
| 0.6284722222222222 | 671.22 |
| 0.6291666666666667 | 667.123 |
| 0.6298611111111111 | 658.909 |
| 0.6305555555555555 | 650.667 |
| 0.63125 | 642.4 |
| 0.6319444444444444 | 634.105 |
| 0.6326388888888889 | 625.784 |
| 0.6333333333333333 | 621.613 |
| 0.6340277777777777 | 431.833 |
| 0.6347222222222222 | 364.728 |
| 0.6354166666666666 | 301.354 |
| 0.6361111111111112 | 287.709 |
| 0.6368055555555555 | 283.156 |
| 0.6375000000000001 | 278.603 |
| 0.6381944444444444 | 269.49 |
| 0.638888888888889 | 264.932 |
| 0.6395833333333333 | 264.932 |
| 0.6402777777777778 | 255.813 |
| 0.6409722222222222 | 251.251 |
| 0.6416666666666667 | 246.689 |
| 0.642361111111111 | 246.689 |
| 0.6430555555555556 | 255.813 |
| 0.6437499999999999 | 242.127 |
| 0.6444444444444445 | 467.187 |
| 0.6451388888888888 | 497.836 |
| 0.6458333333333334 | 497.836 |
| 0.6465277777777778 | 497.836 |
| 0.6472222222222223 | 497.836 |
| 0.6479166666666667 | 497.836 |
| 0.6486111111111111 | 436.27 |
| 0.6493055555555556 | 502.192 |
| 0.65 | 292.259 |
| 0.6506944444444445 | 287.709 |
| 0.6513888888888889 | 283.156 |
| 0.6520833333333333 | 278.603 |
| 0.6527777777777778 | 269.49 |
| 0.6534722222222222 | 260.373 |
| 0.6541666666666667 | 251.251 |
| 0.6548611111111111 | 246.689 |
| 0.6555555555555556 | 237.564 |
| 0.65625 | 228.436 |
| 0.6569444444444444 | 223.873 |
| 0.6576388888888889 | 219.309 |
| 0.6583333333333333 | 223.873 |
| 0.6590277777777778 | 219.309 |
| 0.6597222222222222 | 219.309 |
| 0.6604166666666667 | 219.309 |
| 0.6611111111111111 | 219.309 |
| 0.6618055555555555 | 274.047 |
| 0.6625 | 355.712 |
| 0.6631944444444444 | 355.712 |
| 0.6638888888888889 | 360.221 |
| 0.6645833333333333 | 233 |
| 0.6652777777777777 | 237.564 |
| 0.6659722222222222 | 251.251 |
| 0.6666666666666666 | 283.156 |
| 0.6673611111111111 | 264.932 |
| 0.6680555555555556 | 274.047 |
| 0.6687500000000001 | 242.127 |
| 0.6694444444444444 | 242.127 |
| 0.6701388888888888 | 246.689 |
| 0.6708333333333334 | 305.898 |
| 0.6715277777777778 | 274.047 |
| 0.6722222222222222 | 242.127 |
| 0.6729166666666666 | 264.932 |
| 0.6736111111111112 | 328.584 |
| 0.6743055555555556 | 324.052 |
| 0.6749999999999999 | 324.052 |
| 0.6756944444444444 | 319.517 |
| 0.6763888888888889 | 242.127 |
| 0.6770833333333334 | 228.436 |
| 0.6777777777777777 | 237.564 |
| 0.6784722222222223 | 301.354 |
| 0.6791666666666667 | 301.354 |
| 0.6798611111111111 | 301.354 |
| 0.6805555555555555 | 296.808 |
| 0.68125 | 292.259 |
| 0.6819444444444445 | 292.259 |
| 0.6826388888888889 | 287.709 |
| 0.6833333333333332 | 283.156 |
| 0.6840277777777778 | 278.603 |
| 0.6847222222222222 | 278.603 |
| 0.6854166666666667 | 274.047 |
| 0.686111111111111 | 269.49 |
| 0.6868055555555556 | 269.49 |
| 0.6875 | 233 |
| 0.6881944444444444 | 260.373 |
| 0.688888888888889 | 255.813 |
| 0.6895833333333333 | 251.251 |
| 0.6902777777777778 | 251.251 |
| 0.6909722222222222 | 242.127 |
| 0.6916666666666668 | 237.564 |
| 0.6923611111111111 | 233 |
| 0.6930555555555555 | 233 |
| 0.69375 | 233 |
| 0.6944444444444445 | 233 |
| 0.6951388888888889 | 233 |
| 0.6958333333333333 | 228.436 |
| 0.6965277777777777 | 228.436 |
| 0.6972222222222223 | 228.436 |
| 0.6979166666666666 | 228.436 |
| 0.6986111111111111 | 228.436 |
| 0.6993055555555556 | 223.873 |
| 0.7000000000000001 | 223.873 |
| 0.7006944444444444 | 219.309 |
| 0.7013888888888888 | 219.309 |
| 0.7020833333333334 | 219.309 |
| 0.7027777777777778 | 214.746 |
| 0.7034722222222222 | 210.182 |
| 0.7041666666666666 | 210.182 |
| 0.7048611111111112 | 205.62 |
| 0.7055555555555556 | 201.058 |
| 0.7062499999999999 | 201.058 |
| 0.7069444444444444 | 191.937 |
| 0.7076388888888889 | 191.937 |
| 0.7083333333333334 | 187.378 |
| 0.7090277777777777 | 187.378 |
| 0.7097222222222223 | 182.82 |
| 0.7104166666666667 | 182.82 |
| 0.7111111111111111 | 182.82 |
| 0.7118055555555555 | 178.264 |
| 0.7125 | 178.264 |
| 0.7131944444444445 | 173.709 |
| 0.7138888888888889 | 173.709 |
| 0.7145833333333332 | 169.156 |
| 0.7152777777777778 | 169.156 |
| 0.7159722222222222 | 164.605 |
| 0.7166666666666667 | 164.605 |
| 0.717361111111111 | 164.605 |
| 0.7180555555555556 | 160.056 |
| 0.71875 | 160.056 |
| 0.7194444444444444 | 155.509 |
| 0.720138888888889 | 155.509 |
| 0.7208333333333333 | 155.509 |
| 0.7215277777777778 | 150.964 |
| 0.7222222222222222 | 150.964 |
| 0.7229166666666668 | 150.964 |
| 0.7236111111111111 | 146.423 |
| 0.7243055555555555 | 146.423 |
| 0.725 | 146.423 |
| 0.7256944444444445 | 146.423 |
| 0.7263888888888889 | 141.884 |
| 0.7270833333333333 | 141.884 |
| 0.7277777777777777 | 141.884 |
| 0.7284722222222223 | 137.347 |
| 0.7291666666666666 | 137.347 |
| 0.7298611111111111 | 137.347 |
| 0.7305555555555556 | 137.347 |
| 0.7312500000000001 | 137.347 |
| 0.7319444444444444 | 132.814 |
| 0.7326388888888888 | 132.814 |
| 0.7333333333333334 | 132.814 |
| 0.7340277777777778 | 128.284 |
| 0.7347222222222222 | 128.284 |
| 0.7354166666666666 | 128.284 |
| 0.7361111111111112 | 128.284 |
| 0.7368055555555556 | 128.284 |
| 0.7374999999999999 | 123.758 |
| 0.7381944444444444 | 123.758 |
| 0.7388888888888889 | 123.758 |
| 0.7395833333333334 | 123.758 |
| 0.7402777777777777 | 123.758 |
| 0.7409722222222223 | 119.235 |
| 0.7416666666666667 | 119.235 |
| 0.7423611111111111 | 119.235 |
| 0.7430555555555555 | 119.235 |
| 0.74375 | 114.716 |
| 0.7444444444444445 | 114.716 |
| 0.7451388888888889 | 114.716 |
| 0.7458333333333332 | 110.201 |
| 0.7465277777777778 | 110.201 |
| 0.7472222222222222 | 110.201 |
| 0.7479166666666667 | 110.201 |
| 0.748611111111111 | 105.69 |
| 0.7493055555555556 | 105.69 |
| 0.75 | 105.69 |
| 0.7506944444444444 | 101.184 |
| 0.751388888888889 | 101.184 |
| 0.7520833333333333 | 101.184 |
| 0.7527777777777778 | 101.184 |
| 0.7534722222222222 | 96.682 |
| 0.7541666666666668 | 96.682 |
| 0.7548611111111111 | 92.184 |
| 0.7555555555555555 | 92.184 |
| 0.75625 | 92.184 |
| 0.7569444444444445 | 92.184 |
| 0.7576388888888889 | 87.692 |
| 0.7583333333333333 | 87.692 |
| 0.7590277777777777 | 87.692 |
| 0.7597222222222223 | 83.205 |
| 0.7604166666666666 | 83.205 |
| 0.7611111111111111 | 83.205 |
| 0.7618055555555556 | 83.205 |
| 0.7625000000000001 | 78.722 |
| 0.7631944444444444 | 78.722 |
| 0.7638888888888888 | 78.722 |
| 0.7645833333333334 | 74.246 |
| 0.7652777777777778 | 74.246 |
| 0.7659722222222222 | 74.246 |
| 0.7666666666666666 | 74.246 |
| 0.7673611111111112 | 69.775 |
| 0.7680555555555556 | 69.775 |
| 0.7687499999999999 | 69.775 |
| 0.7694444444444444 | 69.775 |
| 0.7701388888888889 | 65.31 |
| 0.7708333333333334 | 65.31 |
| 0.7715277777777777 | 65.31 |
| 0.7722222222222223 | 60.85 |
| 0.7729166666666667 | 60.85 |
| 0.7736111111111111 | 60.85 |
| 0.7743055555555555 | 56.398 |
| 0.775 | 56.398 |
| 0.7756944444444445 | 56.398 |
| 0.7763888888888889 | 51.951 |
| 0.7770833333333332 | 51.951 |
| 0.7777777777777778 | 47.511 |
| 0.7784722222222222 | 47.511 |
| 0.7791666666666667 | 47.511 |
| 0.779861111111111 | 47.511 |
| 0.7805555555555556 | 43.079 |
| 0.78125 | 43.079 |
| 0.7819444444444444 | 43.079 |
| 0.782638888888889 | 43.079 |
| 0.7833333333333333 | 38.653 |
| 0.7840277777777778 | 38.653 |
| 0.7847222222222222 | 38.653 |
| 0.7854166666666668 | 34.234 |
| 0.7861111111111111 | 34.234 |
| 0.7868055555555555 | 34.234 |
| 0.7875 | 29.823 |
| 0.7881944444444445 | 29.823 |
| 0.7888888888888889 | 29.823 |
| 0.7895833333333333 | 29.823 |
| 0.7902777777777777 | 25.419 |
| 0.7909722222222223 | 25.419 |
| 0.7916666666666666 | 25.419 |
| 0.7923611111111111 | 21.024 |
| 0.7930555555555556 | 21.024 |
| 0.7937500000000001 | 21.024 |
| 0.7944444444444444 | 21.024 |
| 0.7951388888888888 | 21.024 |
| 0.7958333333333334 | 16.636 |
| 0.7965277777777778 | 16.636 |
| 0.7972222222222222 | 16.636 |
| 0.7979166666666666 | 16.636 |
| 0.7986111111111112 | 12.257 |
| 0.7993055555555556 | 12.257 |
| 0.7999999999999999 | 12.257 |
| 0.8006944444444444 | 12.257 |
| 0.8013888888888889 | 12.257 |
| 0.8020833333333334 | 7.887 |
| 0.8027777777777777 | 7.887 |
| 0.8034722222222223 | 7.887 |
| 0.8041666666666667 | 7.887 |
| 0.8048611111111111 | 7.887 |
| 0.8055555555555555 | 3.525 |
| 0.80625 | 3.525 |
| 0.8069444444444445 | 3.525 |
| 0.8076388888888889 | 3.525 |
| 0.8083333333333332 | 3.525 |
| 0.8090277777777778 | 3.525 |
| 0.8097222222222222 | 3.525 |
| 0.8104166666666667 | 0 |
| 0.811111111111111 | 0 |
| 0.8118055555555556 | 0 |
| 0.8125 | 0 |
| 0.8131944444444444 | 0 |
| 0.813888888888889 | 0 |
| 0.8145833333333333 | 0 |
| 0.8152777777777778 | 0 |
| 0.8159722222222222 | 0 |
| 0.8166666666666668 | 0 |
| 0.8173611111111111 | 0 |
| 0.8180555555555555 | 0 |
| 0.81875 | 0 |
| 0.8194444444444445 | 0 |
| 0.8201388888888889 | 0 |
| 0.8208333333333333 | 0 |
| 0.8215277777777777 | 0 |
| 0.8222222222222223 | 0 |
| 0.8229166666666666 | 0 |
| 0.8236111111111111 | 0 |
| 0.8243055555555556 | 0 |
| 0.8250000000000001 | 0 |
| 0.8256944444444444 | 0 |
| 0.8263888888888888 | 0 |
| 0.8270833333333334 | 0 |
| 0.8277777777777778 | 0 |
| 0.8284722222222222 | 0 |
| 0.8291666666666666 | 0 |
| 0.8298611111111112 | 0 |
| 0.8305555555555556 | 0 |
| 0.8312499999999999 | 0 |
| 0.8319444444444444 | 0 |
| 0.8326388888888889 | 0 |
| 0.8333333333333334 | 0 |
| 0.8340277777777777 | 0 |
| 0.8347222222222223 | 0 |
| 0.8354166666666667 | 0 |
| 0.8361111111111111 | 0 |
| 0.8368055555555555 | 0 |
| 0.8375 | 0 |
| 0.8381944444444445 | 0 |
| 0.8388888888888889 | 0 |
| 0.8395833333333332 | 0 |
| 0.8402777777777778 | 0 |
| 0.8409722222222222 | 0 |
| 0.8416666666666667 | 0 |
| 0.842361111111111 | 0 |
| 0.8430555555555556 | 0 |
| 0.84375 | 0 |
| 0.8444444444444444 | 0 |
| 0.845138888888889 | 0 |
| 0.8458333333333333 | 0 |
| 0.8465277777777778 | 0 |
| 0.8472222222222222 | 0 |
| 0.8479166666666668 | 0 |
| 0.8486111111111111 | 0 |
| 0.8493055555555555 | 0 |
| 0.85 | 0 |
| 0.8506944444444445 | 0 |
| 0.8513888888888889 | 0 |
| 0.8520833333333333 | 0 |
| 0.8527777777777777 | 0 |
| 0.8534722222222223 | 0 |
| 0.8541666666666666 | 0 |
| 0.8548611111111111 | 0 |
| 0.8555555555555556 | 0 |
| 0.8562500000000001 | 0 |
| 0.8569444444444444 | 0 |
| 0.8576388888888888 | 0 |
| 0.8583333333333334 | 0 |
| 0.8590277777777778 | 0 |
| 0.8597222222222222 | 0 |
| 0.8604166666666666 | 0 |
| 0.8611111111111112 | 0 |
| 0.8618055555555556 | 0 |
| 0.8624999999999999 | 0 |
| 0.8631944444444444 | 0 |
| 0.8638888888888889 | 0 |
| 0.8645833333333334 | 0 |
| 0.8652777777777777 | 0 |
| 0.8659722222222223 | 0 |
| 0.8666666666666667 | 0 |
| 0.8673611111111111 | 0 |
| 0.8680555555555555 | 0 |
| 0.86875 | 0 |
| 0.8694444444444445 | 0 |
| 0.8701388888888889 | 0 |
| 0.8708333333333332 | 0 |
| 0.8715277777777778 | 0 |
| 0.8722222222222222 | 0 |
| 0.8729166666666667 | 0 |
| 0.873611111111111 | 0 |
| 0.8743055555555556 | 0 |
| 0.875 | 0 |
| 0.8756944444444444 | 0 |
| 0.876388888888889 | 0 |
| 0.8770833333333333 | 0 |
| 0.8777777777777778 | 0 |
| 0.8784722222222222 | 0 |
| 0.8791666666666668 | 0 |
| 0.8798611111111111 | 0 |
| 0.8805555555555555 | 0 |
| 0.88125 | 0 |
| 0.8819444444444445 | 0 |
| 0.8826388888888889 | 0 |
| 0.8833333333333333 | 0 |
| 0.8840277777777777 | 0 |
| 0.8847222222222223 | 0 |
| 0.8854166666666666 | 0 |
| 0.8861111111111111 | 0 |
| 0.8868055555555556 | 0 |
| 0.8875000000000001 | 0 |
| 0.8881944444444444 | 0 |
| 0.8888888888888888 | 0 |
| 0.8895833333333334 | 0 |
| 0.8902777777777778 | 0 |
| 0.8909722222222222 | 0 |
| 0.8916666666666666 | 0 |
| 0.8923611111111112 | 0 |
| 0.8930555555555556 | 0 |
| 0.8937499999999999 | 0 |
| 0.8944444444444444 | 0 |
| 0.8951388888888889 | 0 |
| 0.8958333333333334 | 0 |
| 0.8965277777777777 | 0 |
| 0.8972222222222223 | 0 |
| 0.8979166666666667 | 0 |
| 0.8986111111111111 | 0 |
| 0.8993055555555555 | 0 |
| 0.9 | 0 |
| 0.9006944444444445 | 0 |
| 0.9013888888888889 | 0 |
| 0.9020833333333332 | 0 |
| 0.9027777777777778 | 0 |
| 0.9034722222222222 | 0 |
| 0.9041666666666667 | 0 |
| 0.904861111111111 | 0 |
| 0.9055555555555556 | 0 |
| 0.90625 | 0 |
| 0.9069444444444444 | 0 |
| 0.907638888888889 | 0 |
| 0.9083333333333333 | 0 |
| 0.9090277777777778 | 0 |
| 0.9097222222222222 | 0 |
| 0.9104166666666668 | 0 |
| 0.9111111111111111 | 0 |
| 0.9118055555555555 | 0 |
| 0.9125 | 0 |
| 0.9131944444444445 | 0 |
| 0.9138888888888889 | 0 |
| 0.9145833333333333 | 0 |
| 0.9152777777777777 | 0 |
| 0.9159722222222223 | 0 |
| 0.9166666666666666 | 0 |
| 0.9173611111111111 | 0 |
| 0.9180555555555556 | 0 |
| 0.9187500000000001 | 0 |
| 0.9194444444444444 | 0 |
| 0.9201388888888888 | 0 |
| 0.9208333333333334 | 0 |
| 0.9215277777777778 | 0 |
| 0.9222222222222222 | 0 |
| 0.9229166666666666 | 0 |
| 0.9236111111111112 | 0 |
| 0.9243055555555556 | 0 |
| 0.9249999999999999 | 0 |
| 0.9256944444444444 | 0 |
| 0.9263888888888889 | 0 |
| 0.9270833333333334 | 0 |
| 0.9277777777777777 | 0 |
| 0.9284722222222223 | 0 |
| 0.9291666666666667 | 0 |
| 0.9298611111111111 | 0 |
| 0.9305555555555555 | 0 |
| 0.93125 | 0 |
| 0.9319444444444445 | 0 |
| 0.9326388888888889 | 0 |
| 0.9333333333333332 | 0 |
| 0.9340277777777778 | 0 |
| 0.9347222222222222 | 0 |
| 0.9354166666666667 | 0 |
| 0.936111111111111 | 0 |
| 0.9368055555555556 | 0 |
| 0.9375 | 0 |
| 0.9381944444444444 | 0 |
| 0.938888888888889 | 0 |
| 0.9395833333333333 | 0 |
| 0.9402777777777778 | 0 |
| 0.9409722222222222 | 0 |
| 0.9416666666666668 | 0 |
| 0.9423611111111111 | 0 |
| 0.9430555555555555 | 0 |
| 0.94375 | 0 |
| 0.9444444444444445 | 0 |
| 0.9451388888888889 | 0 |
| 0.9458333333333333 | 0 |
| 0.9465277777777777 | 0 |
| 0.9472222222222223 | 0 |
| 0.9479166666666666 | 0 |
| 0.9486111111111111 | 0 |
| 0.9493055555555556 | 0 |
| 0.9500000000000001 | 0 |
| 0.9506944444444444 | 0 |
| 0.9513888888888888 | 0 |
| 0.9520833333333334 | 0 |
| 0.9527777777777778 | 0 |
| 0.9534722222222222 | 0 |
| 0.9541666666666666 | 0 |
| 0.9548611111111112 | 0 |
| 0.9555555555555556 | 0 |
| 0.9562499999999999 | 0 |
| 0.9569444444444444 | 0 |
| 0.9576388888888889 | 0 |
| 0.9583333333333334 | 0 |
| 0.9590277777777777 | 0 |
| 0.9597222222222223 | 0 |
| 0.9604166666666667 | 0 |
| 0.9611111111111111 | 0 |
| 0.9618055555555555 | 0 |
| 0.9625 | 0 |
| 0.9631944444444445 | 0 |
| 0.9638888888888889 | 0 |
| 0.9645833333333332 | 0 |
| 0.9652777777777778 | 0 |
| 0.9659722222222222 | 0 |
| 0.9666666666666667 | 0 |
| 0.967361111111111 | 0 |
| 0.9680555555555556 | 0 |
| 0.96875 | 0 |
| 0.9694444444444444 | 0 |
| 0.970138888888889 | 0 |
| 0.9708333333333333 | 0 |
| 0.9715277777777778 | 0 |
| 0.9722222222222222 | 0 |
| 0.9729166666666668 | 0 |
| 0.9736111111111111 | 0 |
| 0.9743055555555555 | 0 |
| 0.975 | 0 |
| 0.9756944444444445 | 0 |
| 0.9763888888888889 | 0 |
| 0.9770833333333333 | 0 |
| 0.9777777777777777 | 0 |
| 0.9784722222222223 | 0 |
| 0.9791666666666666 | 0 |
| 0.9798611111111111 | 0 |
| 0.9805555555555556 | 0 |
| 0.9812500000000001 | 0 |
| 0.9819444444444444 | 0 |
| 0.9826388888888888 | 0 |
| 0.9833333333333334 | 0 |
| 0.9840277777777778 | 0 |
| 0.9847222222222222 | 0 |
| 0.9854166666666666 | 0 |
| 0.9861111111111112 | 0 |
| 0.9868055555555556 | 0 |
| 0.9874999999999999 | 0 |
| 0.9881944444444444 | 0 |
| 0.9888888888888889 | 0 |
| 0.9895833333333334 | 0 |
| 0.9902777777777777 | 0 |
| 0.9909722222222223 | 0 |
| 0.9916666666666667 | 0 |
| 0.9923611111111111 | 0 |
| 0.9930555555555555 | 0 |
| 0.99375 | 0 |
| 0.9944444444444445 | 0 |
| 0.9951388888888889 | 0 |
| 0.9958333333333332 | 0 |
| 0.9965277777777778 | 0 |
| 0.9972222222222222 | 0 |
| 0.9979166666666667 | 0 |
| 0.998611111111111 | 0 |
| 0.9993055555555556 | 0 |